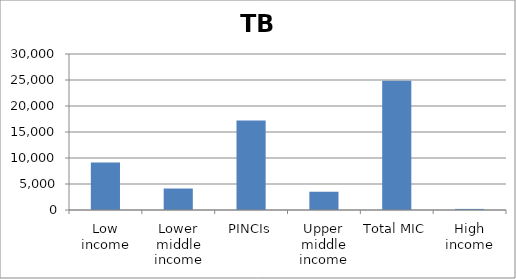
| Category | Series 0 |
|---|---|
| Low income | 9115.55 |
| Lower middle income | 4128.582 |
| PINCIs | 17220.93 |
| Upper middle income | 3513.05 |
| Total MIC | 24862.562 |
| High income | 209.572 |